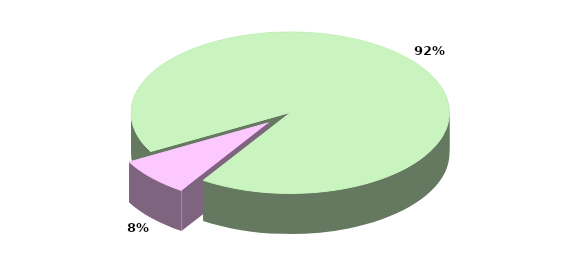
| Category | Series 0 |
|---|---|
| TOTALE ENTRATE CORRENTI | 22526.845 |
| TOTALE ENTRATE IN CONTO CAPITALE | 1890.071 |